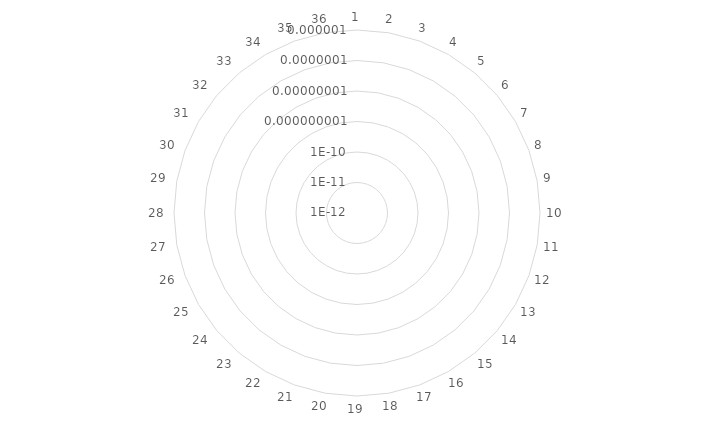
| Category | miR-143-3p | miR-423-5p | miR-193-3p | miR-130b-3p | miR-210-3p | miR-486-5p |
|---|---|---|---|---|---|---|
| 1.0 | 0 | 0 | 0 | 0 | 0 | 0 |
| 2.0 | 0 | 0 | 0 | 0 | 0 | 0 |
| 3.0 | 0 | 0 | 0 | 0 | 0 | 0 |
| 4.0 | 0 | 0 | 0 | 0 | 0 | 0 |
| 5.0 | 0 | 0 | 0 | 0 | 0 | 0 |
| 6.0 | 0 | 0 | 0 | 0 | 0 | 0 |
| 7.0 | 0 | 0 | 0 | 0 | 0 | 0 |
| 8.0 | 0 | 0 | 0 | 0 | 0 | 0 |
| 9.0 | 0 | 0 | 0 | 0 | 0 | 0 |
| 10.0 | 0 | 0 | 0 | 0 | 0 | 0 |
| 11.0 | 0 | 0 | 0 | 0 | 0 | 0 |
| 12.0 | 0 | 0 | 0 | 0 | 0 | 0 |
| 13.0 | 0 | 0 | 0 | 0 | 0 | 0 |
| 14.0 | 0 | 0 | 0 | 0 | 0 | 0 |
| 15.0 | 0 | 0 | 0 | 0 | 0 | 0 |
| 16.0 | 0 | 0 | 0 | 0 | 0 | 0 |
| 17.0 | 0 | 0 | 0 | 0 | 0 | 0 |
| 18.0 | 0 | 0 | 0 | 0 | 0 | 0 |
| 19.0 | 0 | 0 | 0 | 0 | 0 | 0 |
| 20.0 | 0 | 0 | 0 | 0 | 0 | 0 |
| 21.0 | 0 | 0 | 0 | 0 | 0 | 0 |
| 22.0 | 0 | 0 | 0 | 0 | 0 | 0 |
| 23.0 | 0 | 0 | 0 | 0 | 0 | 0 |
| 24.0 | 0 | 0 | 0 | 0 | 0 | 0 |
| 25.0 | 0 | 0 | 0 | 0 | 0 | 0 |
| 26.0 | 0 | 0 | 0 | 0 | 0 | 0 |
| 27.0 | 0 | 0 | 0 | 0 | 0 | 0 |
| 28.0 | 0 | 0 | 0 | 0 | 0 | 0 |
| 29.0 | 0 | 0 | 0 | 0 | 0 | 0 |
| 30.0 | 0 | 0 | 0 | 0 | 0 | 0 |
| 31.0 | 0 | 0 | 0 | 0 | 0 | 0 |
| 32.0 | 0 | 0 | 0 | 0 | 0 | 0 |
| 33.0 | 0 | 0 | 0 | 0 | 0 | 0 |
| 34.0 | 0 | 0 | 0 | 0 | 0 | 0 |
| 35.0 | 0 | 0 | 0 | 0 | 0 | 0 |
| 36.0 | 0 | 0 | 0 | 0 | 0 | 0 |